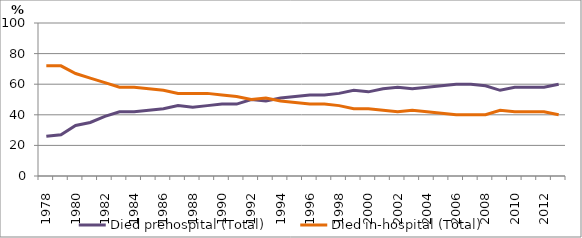
| Category | Died prehospital (Total) | Died in-hospital (Total) |
|---|---|---|
| 1978.0 | 26 | 72 |
| 1979.0 | 27 | 72 |
| 1980.0 | 33 | 67 |
| 1981.0 | 35 | 64 |
| 1982.0 | 39 | 61 |
| 1983.0 | 42 | 58 |
| 1984.0 | 42 | 58 |
| 1985.0 | 43 | 57 |
| 1986.0 | 44 | 56 |
| 1987.0 | 46 | 54 |
| 1988.0 | 45 | 54 |
| 1989.0 | 46 | 54 |
| 1990.0 | 47 | 53 |
| 1991.0 | 47 | 52 |
| 1992.0 | 50 | 50 |
| 1993.0 | 49 | 51 |
| 1994.0 | 51 | 49 |
| 1995.0 | 52 | 48 |
| 1996.0 | 53 | 47 |
| 1997.0 | 53 | 47 |
| 1998.0 | 54 | 46 |
| 1999.0 | 56 | 44 |
| 2000.0 | 55 | 44 |
| 2001.0 | 57 | 43 |
| 2002.0 | 58 | 42 |
| 2003.0 | 57 | 43 |
| 2004.0 | 58 | 42 |
| 2005.0 | 59 | 41 |
| 2006.0 | 60 | 40 |
| 2007.0 | 60 | 40 |
| 2008.0 | 59 | 40 |
| 2009.0 | 56 | 43 |
| 2010.0 | 58 | 42 |
| 2011.0 | 58 | 42 |
| 2012.0 | 58 | 42 |
| 2013.0 | 60 | 40 |